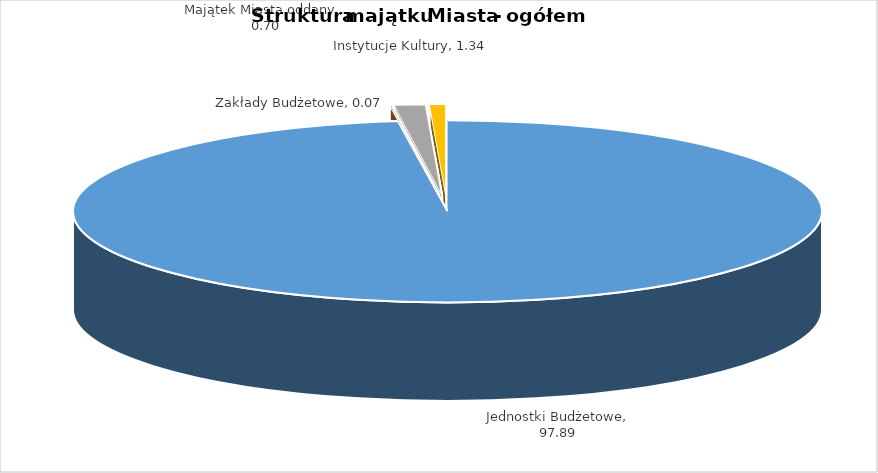
| Category | Struktura majątku Miasta - ogółem | Dynamika przyrostu majątku brutto w porównaniu do stanu na dzień 01.01.2022r.  |
|---|---|---|
| Jednostki Budżetowe | 97.89 | 103.19 |
| Zakłady Budżetowe | 0.07 | 119.9 |
| Instytucje Kultury | 1.34 | 103.84 |
| Majątek Miasta oddany  | 0.7 | 100.82 |